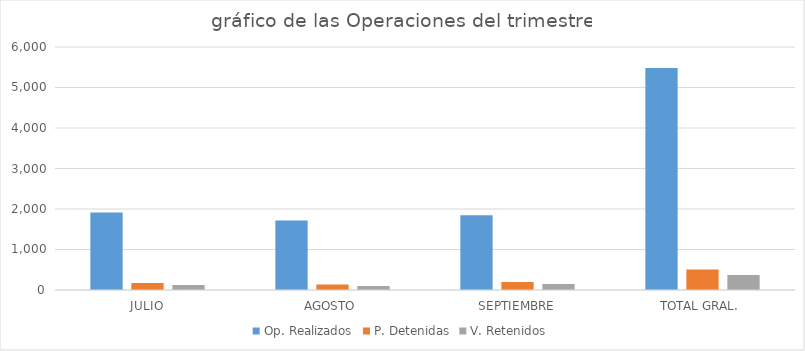
| Category | Op. Realizados | P. Detenidas | V. Retenidos |
|---|---|---|---|
| JULIO | 1915 | 172 | 125 |
| AGOSTO | 1717 | 138 | 97 |
| SEPTIEMBRE | 1847 | 196 | 148 |
| TOTAL GRAL. | 5479 | 506 | 370 |